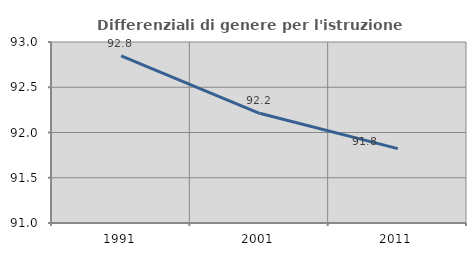
| Category | Differenziali di genere per l'istruzione superiore |
|---|---|
| 1991.0 | 92.846 |
| 2001.0 | 92.212 |
| 2011.0 | 91.821 |